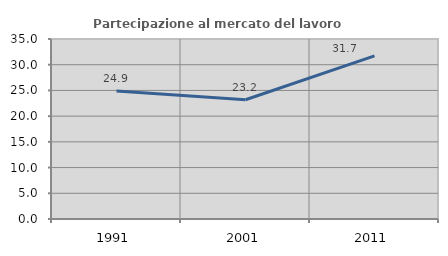
| Category | Partecipazione al mercato del lavoro  femminile |
|---|---|
| 1991.0 | 24.868 |
| 2001.0 | 23.182 |
| 2011.0 | 31.711 |